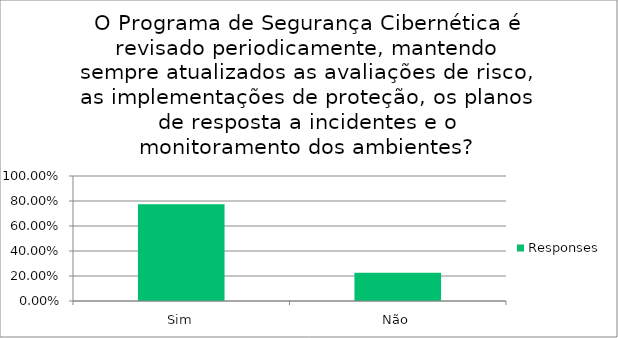
| Category | Responses |
|---|---|
| Sim | 0.773 |
| Não | 0.227 |